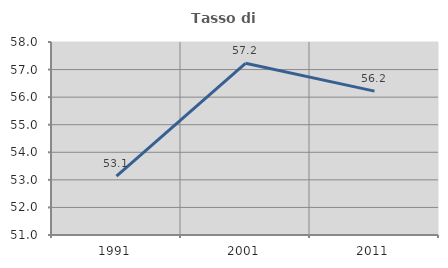
| Category | Tasso di occupazione   |
|---|---|
| 1991.0 | 53.134 |
| 2001.0 | 57.227 |
| 2011.0 | 56.218 |